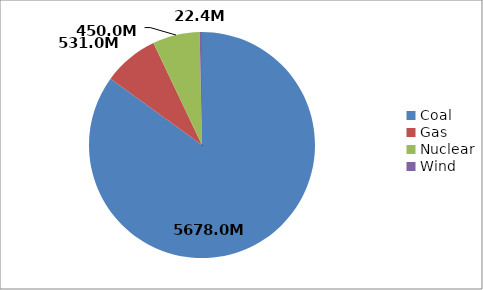
| Category | Series 0 |
|---|---|
| Coal | 5678 |
| Gas | 531 |
| Nuclear | 450 |
| Wind | 22.4 |